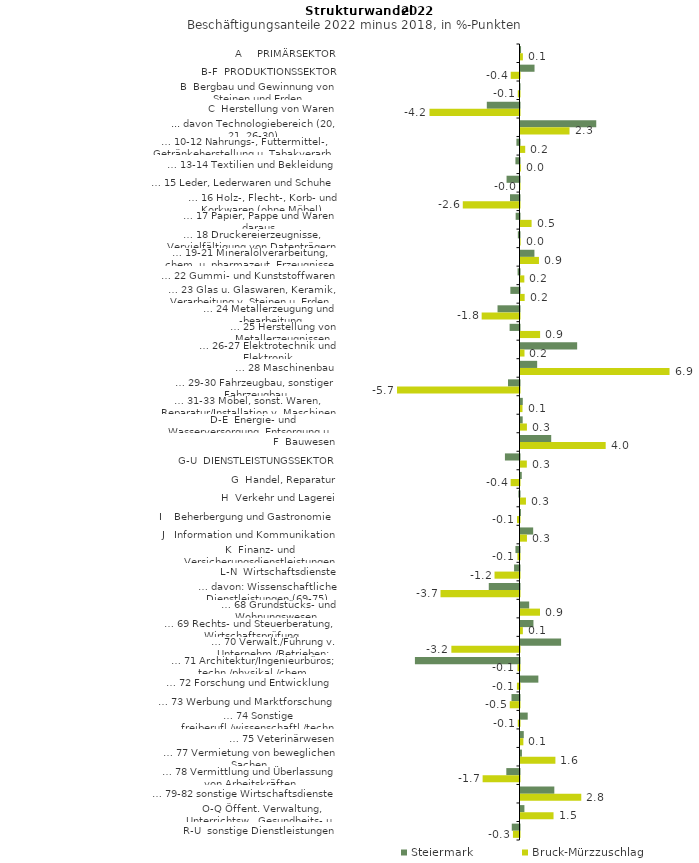
| Category | Steiermark | Bruck-Mürzzuschlag |
|---|---|---|
| A     PRIMÄRSEKTOR | 0.025 | 0.111 |
| B-F  PRODUKTIONSSEKTOR | 0.65 | -0.407 |
| B  Bergbau und Gewinnung von Steinen und Erden | -0.011 | -0.08 |
| C  Herstellung von Waren | -1.516 | -4.174 |
| ... davon Technologiebereich (20, 21, 26-30) | 3.513 | 2.273 |
| … 10-12 Nahrungs-, Futtermittel-, Getränkeherstellung u. Tabakverarb. | -0.143 | 0.218 |
| … 13-14 Textilien und Bekleidung | -0.189 | 0.016 |
| … 15 Leder, Lederwaren und Schuhe | -0.6 | -0.007 |
| … 16 Holz-, Flecht-, Korb- und Korkwaren (ohne Möbel)  | -0.44 | -2.63 |
| … 17 Papier, Pappe und Waren daraus  | -0.178 | 0.515 |
| … 18 Druckereierzeugnisse, Vervielfältigung von Datenträgern | -0.077 | 0.005 |
| … 19-21 Mineralölverarbeitung, chem. u. pharmazeut. Erzeugnisse | 0.646 | 0.856 |
| … 22 Gummi- und Kunststoffwaren | -0.089 | 0.178 |
| … 23 Glas u. Glaswaren, Keramik, Verarbeitung v. Steinen u. Erden  | -0.424 | 0.193 |
| … 24 Metallerzeugung und -bearbeitung | -1.019 | -1.755 |
| … 25 Herstellung von Metallerzeugnissen  | -0.459 | 0.909 |
| … 26-27 Elektrotechnik und Elektronik | 2.628 | 0.185 |
| … 28 Maschinenbau | 0.773 | 6.912 |
| … 29-30 Fahrzeugbau, sonstiger Fahrzeugbau | -0.534 | -5.68 |
| … 31-33 Möbel, sonst. Waren, Reparatur/Installation v. Maschinen | 0.106 | 0.093 |
| D-E  Energie- und Wasserversorgung, Entsorgung u. Rückgewinnung | 0.102 | 0.298 |
| F  Bauwesen | 1.424 | 3.95 |
| G-U  DIENSTLEISTUNGSSEKTOR | -0.676 | 0.294 |
| G  Handel, Reparatur | 0.059 | -0.411 |
| H  Verkehr und Lagerei | -0.05 | 0.253 |
| I    Beherbergung und Gastronomie | 0.02 | -0.116 |
| J   Information und Kommunikation | 0.588 | 0.3 |
| K  Finanz- und Versicherungsdienstleistungen | -0.188 | -0.096 |
| L-N  Wirtschaftsdienste | -0.252 | -1.158 |
| … davon: Wissenschaftliche Dienstleistungen (69-75) | -1.425 | -3.663 |
| … 68 Grundstücks- und Wohnungswesen  | 0.402 | 0.904 |
| … 69 Rechts- und Steuerberatung, Wirtschaftsprüfung | 0.6 | 0.109 |
| … 70 Verwalt./Führung v. Unternehm./Betrieben; Unternehmensberat. | 1.883 | -3.16 |
| … 71 Architektur/Ingenieurbüros; techn./physikal./chem. Untersuchung | -4.85 | -0.094 |
| … 72 Forschung und Entwicklung  | 0.828 | -0.12 |
| … 73 Werbung und Marktforschung | -0.372 | -0.451 |
| … 74 Sonstige freiberufl./wissenschaftl./techn. Tätigkeiten | 0.334 | -0.08 |
| … 75 Veterinärwesen | 0.152 | 0.133 |
| … 77 Vermietung von beweglichen Sachen  | 0.067 | 1.619 |
| … 78 Vermittlung und Überlassung von Arbeitskräften | -0.611 | -1.71 |
| … 79-82 sonstige Wirtschaftsdienste | 1.569 | 2.818 |
| O-Q Öffent. Verwaltung, Unterrichtsw., Gesundheits- u. Sozialwesen | 0.182 | 1.532 |
| R-U  sonstige Dienstleistungen | -0.359 | -0.304 |